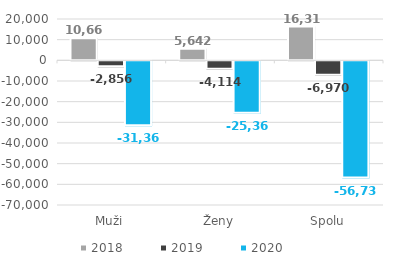
| Category | 2018 | 2019 | 2020 |
|---|---|---|---|
| Muži | 10669.083 | -2856.333 | -31366 |
| Ženy | 5642 | -4113.75 | -25364.083 |
| Spolu | 16311.083 | -6970.083 | -56730.083 |